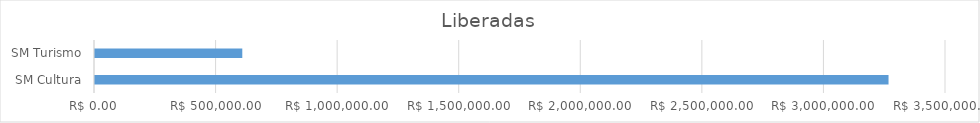
| Category | Series 0 |
|---|---|
| SM Cultura | 3263653.75 |
| SM Turismo | 605772.62 |